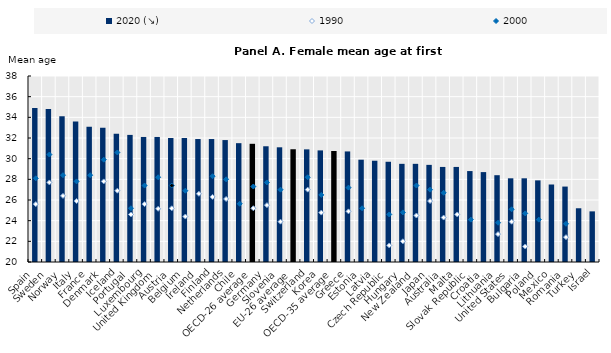
| Category | 2020 (↘) |
|---|---|
| Spain | 34.9 |
| Sweden | 34.8 |
| Norway | 34.1 |
| Italy | 33.6 |
| France | 33.1 |
| Denmark | 33 |
| Iceland | 32.4 |
| Portugal | 32.3 |
| Luxembourg | 32.1 |
| United Kingdom | 32.1 |
| Austria | 32 |
| Belgium | 32 |
| Ireland | 31.9 |
| Finland | 31.9 |
| Netherlands | 31.8 |
| Chile | 31.5 |
| OECD-26 average | 31.438 |
| Germany | 31.2 |
| Slovenia | 31.1 |
| EU-26 average | 30.912 |
| Switzerland | 30.9 |
| Korea | 30.8 |
| OECD-35 average | 30.743 |
| Greece | 30.7 |
| Estonia | 29.9 |
| Latvia | 29.8 |
| Czech Republic | 29.7 |
| Hungary | 29.5 |
| New Zealand | 29.5 |
| Japan | 29.4 |
| Australia | 29.2 |
| Malta | 29.2 |
| Slovak Republic | 28.8 |
| Croatia | 28.7 |
| Lithuania | 28.4 |
| United States | 28.1 |
| Bulgaria | 28.1 |
| Poland | 27.9 |
| Mexico | 27.5 |
| Romania | 27.3 |
| Turkey | 25.2 |
| Israel | 24.9 |